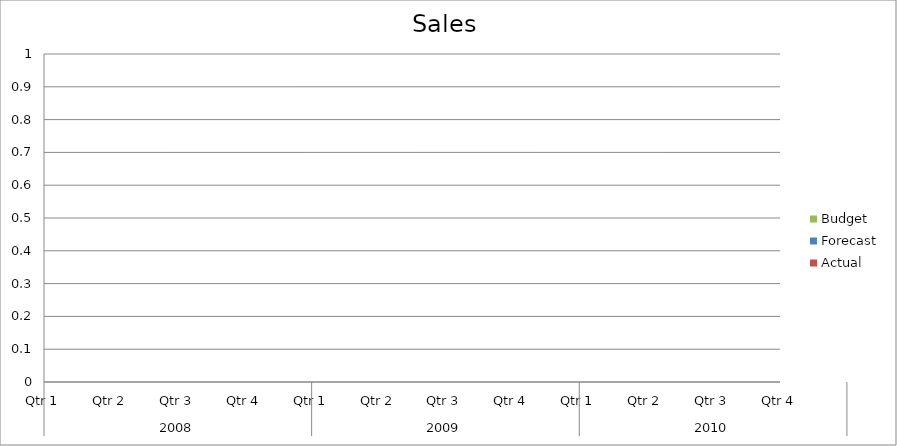
| Category | Budget | Forecast | Actual |
|---|---|---|---|
| 0 | 3360 | 3340 | 2480 |
| 1 | 1580 | 2750 | 770 |
| 2 | 1360 | 1230 | 2200 |
| 3 | 890 | 2030 | 2790 |
| 4 | 2480 | 3110 | 2320 |
| 5 | 530 | 3110 | 950 |
| 6 | 1750 | 2370 | 1950 |
| 7 | 1340 | 1960 | 1030 |
| 8 | 1980 | 1470 | 580 |
| 9 | 1580 | 3260 | 650 |
| 10 | 1400 | 1620 | 1470 |
| 11 | 2940 | 2850 | 2450 |